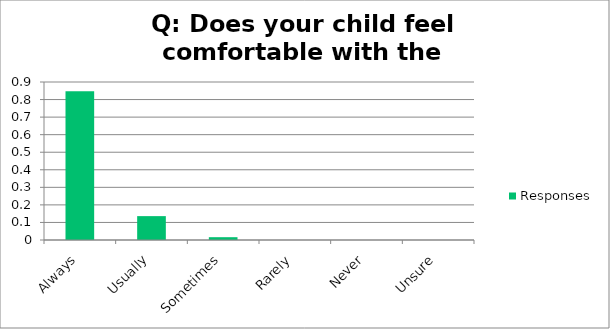
| Category | Responses |
|---|---|
| Always | 0.848 |
| Usually | 0.136 |
| Sometimes | 0.016 |
| Rarely | 0 |
| Never | 0 |
| Unsure | 0 |